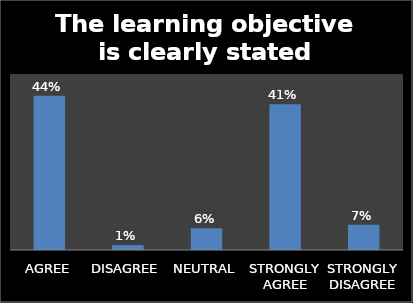
| Category | Series 0 |
|---|---|
| AGREE | 0.438 |
| DISAGREE | 0.014 |
| NEUTRAL | 0.062 |
| STRONGLY AGREE | 0.414 |
| STRONGLY DISAGREE | 0.072 |